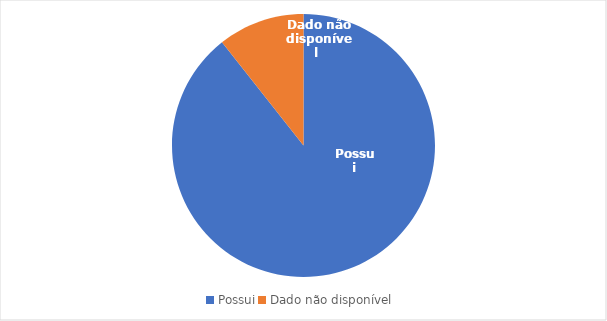
| Category | Series 0 |
|---|---|
| Possui | 42 |
| Dado não disponível  | 5 |